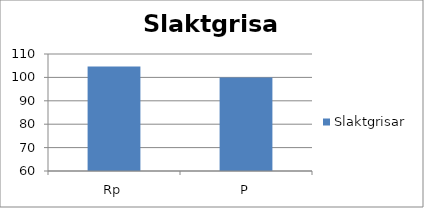
| Category | Slaktgrisar |
|---|---|
| Rp | 104.698 |
| P | 100 |